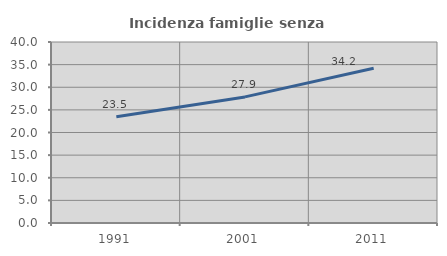
| Category | Incidenza famiglie senza nuclei |
|---|---|
| 1991.0 | 23.498 |
| 2001.0 | 27.867 |
| 2011.0 | 34.188 |